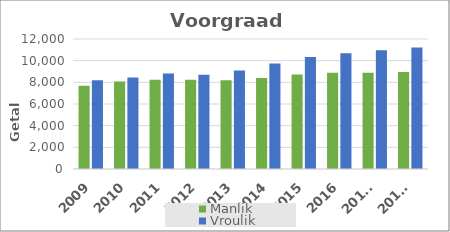
| Category | Manlik | Vroulik |
|---|---|---|
| 2009 | 7682 | 8187 |
| 2010 | 8069 | 8455 |
| 2011 | 8233 | 8818 |
| 2012 | 8236 | 8696 |
| 2013 | 8201 | 9092 |
| 2014 | 8409 | 9729 |
| 2015 | 8712 | 10330 |
| 2016 | 8891 | 10691 |
| 2017* | 8879 | 10965 |
| 2018* | 8955 | 11212 |